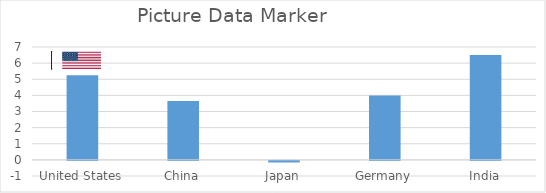
| Category | Series 0 |
|---|---|
| United States | 5.25 |
| China | 3.65 |
| Japan | -0.1 |
| Germany | 4 |
| India | 6.5 |